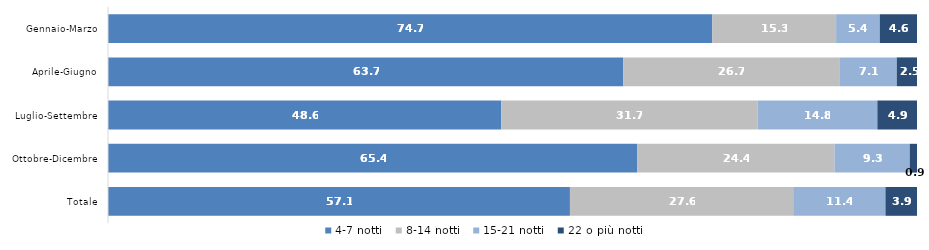
| Category | 4-7 notti | 8-14 notti | 15-21 notti | 22 o più notti |
|---|---|---|---|---|
| Gennaio-Marzo | 74.7 | 15.3 | 5.4 | 4.6 |
| Aprile-Giugno | 63.7 | 26.7 | 7.1 | 2.5 |
| Luglio-Settembre | 48.6 | 31.7 | 14.8 | 4.9 |
| Ottobre-Dicembre | 65.4 | 24.4 | 9.3 | 0.9 |
| Totale | 57.1 | 27.6 | 11.4 | 3.9 |